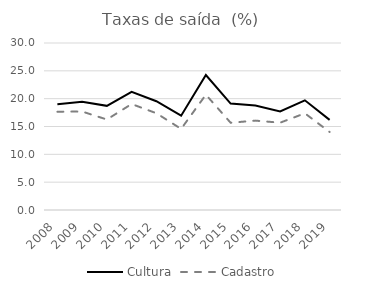
| Category | Cultura | Cadastro |
|---|---|---|
| 2008.0 | 18.99 | 17.655 |
| 2009.0 | 19.426 | 17.69 |
| 2010.0 | 18.709 | 16.255 |
| 2011.0 | 21.219 | 19.039 |
| 2012.0 | 19.544 | 17.383 |
| 2013.0 | 16.939 | 14.57 |
| 2014.0 | 24.254 | 20.713 |
| 2015.0 | 19.123 | 15.676 |
| 2016.0 | 18.756 | 16.056 |
| 2017.0 | 17.689 | 15.686 |
| 2018.0 | 19.707 | 17.368 |
| 2019.0 | 16.185 | 14.014 |